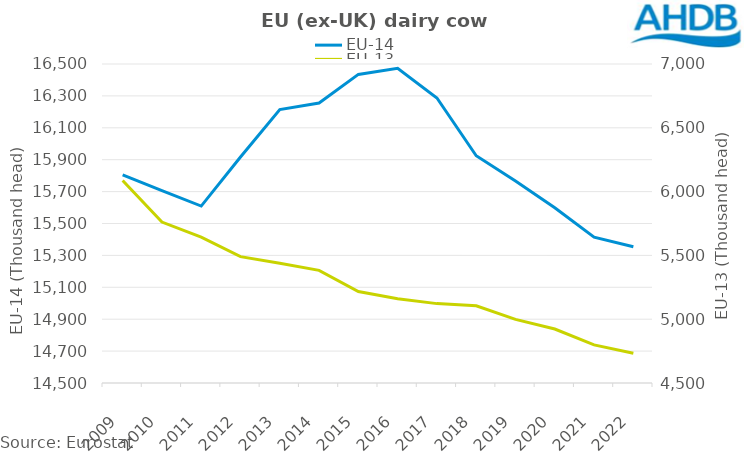
| Category | EU-14 |
|---|---|
| 2009.0 | 15805.27 |
| 2010.0 | 15705.55 |
| 2011.0 | 15609.26 |
| 2012.0 | 15916.9 |
| 2013.0 | 16213.91 |
| 2014.0 | 16255.3 |
| 2015.0 | 16434.77 |
| 2016.0 | 16472.71 |
| 2017.0 | 16287.06 |
| 2018.0 | 15924.64 |
| 2019.0 | 15766.56 |
| 2020.0 | 15598.87 |
| 2021.0 | 15413.98 |
| 2022.0 | 15354.36 |